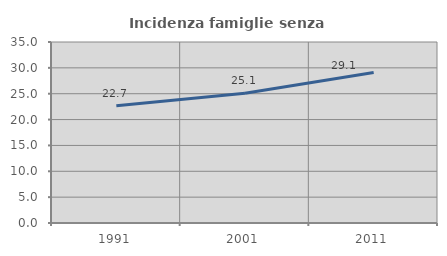
| Category | Incidenza famiglie senza nuclei |
|---|---|
| 1991.0 | 22.657 |
| 2001.0 | 25.085 |
| 2011.0 | 29.098 |